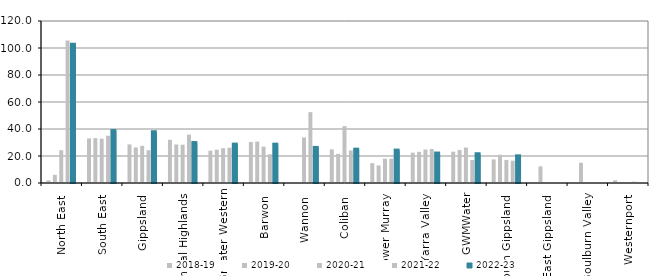
| Category | 2018-19 | 2019-20 | 2020-21 | 2021-22 | 2022-23 |
|---|---|---|---|---|---|
| North East  | 2 | 6 | 24.25 | 105.571 | 102.333 |
| South East  | 33.012 | 33.239 | 32.817 | 35.01 | 38.433 |
| Gippsland  | 28.584 | 26.329 | 27.559 | 24.292 | 37.603 |
| Central Highlands  | 32.015 | 28.542 | 28.359 | 35.795 | 29.593 |
| Greater Western | 23.935 | 24.699 | 25.752 | 26.081 | 28.42 |
| Barwon  | 30.364 | 30.75 | 26.913 | 21.267 | 28.389 |
| Wannon  | 0 | 0 | 33.75 | 52.5 | 26 |
| Coliban  | 24.941 | 21.611 | 42.143 | 24.048 | 24.682 |
| Lower Murray  | 14.7 | 13 | 18 | 18 | 24 |
| Yarra Valley  | 22.481 | 23.103 | 24.81 | 25.2 | 21.826 |
| GWMWater | 23.206 | 24.419 | 26.267 | 16.98 | 21.313 |
| South Gippsland  | 17.453 | 20.921 | 17.098 | 16.541 | 19.76 |
| East Gippsland  | 0 | 12.333 | 0 | 0 | 0 |
| Goulburn Valley  | 0 | 15 | 0 | 0 | 0 |
| Westernport  | 2 | 0 | 0 | 1 | 0 |